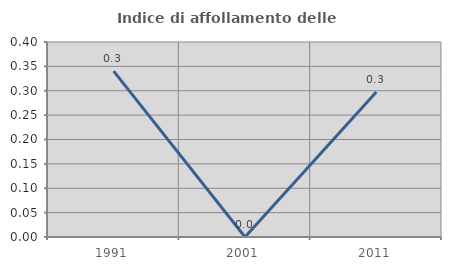
| Category | Indice di affollamento delle abitazioni  |
|---|---|
| 1991.0 | 0.34 |
| 2001.0 | 0 |
| 2011.0 | 0.298 |